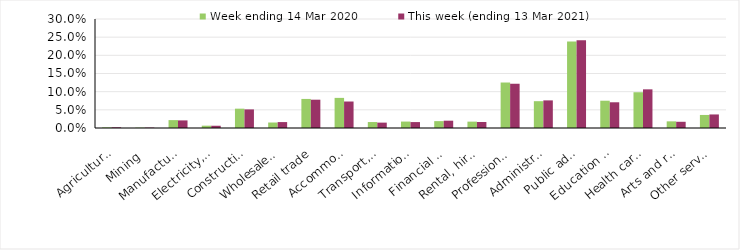
| Category | Week ending 14 Mar 2020 | This week (ending 13 Mar 2021) |
|---|---|---|
| Agriculture, forestry and fishing | 0.002 | 0.002 |
| Mining | 0.001 | 0.001 |
| Manufacturing | 0.022 | 0.021 |
| Electricity, gas, water and waste services | 0.006 | 0.006 |
| Construction | 0.053 | 0.051 |
| Wholesale trade | 0.015 | 0.016 |
| Retail trade | 0.08 | 0.078 |
| Accommodation and food services | 0.083 | 0.073 |
| Transport, postal and warehousing | 0.016 | 0.015 |
| Information media and telecommunications | 0.018 | 0.016 |
| Financial and insurance services | 0.019 | 0.02 |
| Rental, hiring and real estate services | 0.018 | 0.017 |
| Professional, scientific and technical services | 0.125 | 0.122 |
| Administrative and support services | 0.074 | 0.076 |
| Public administration and safety | 0.238 | 0.242 |
| Education and training | 0.075 | 0.071 |
| Health care and social assistance | 0.098 | 0.106 |
| Arts and recreation services | 0.018 | 0.017 |
| Other services | 0.036 | 0.037 |